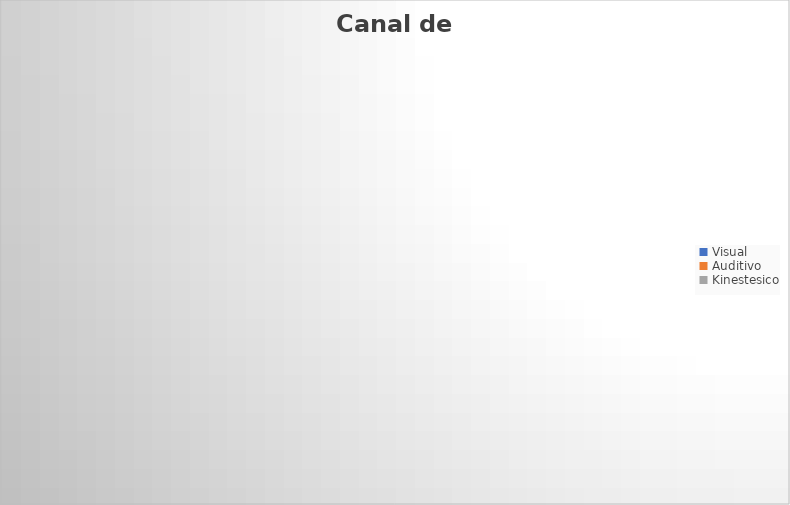
| Category | Series 0 | Series 1 |
|---|---|---|
| Visual |  | 0 |
| Auditivo |  | 0 |
| Kinestesico |  | 0 |